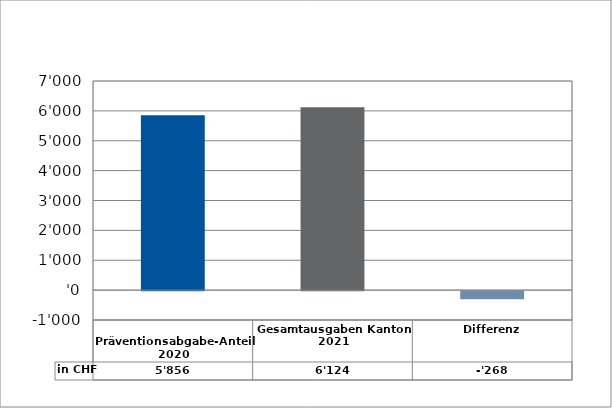
| Category | in CHF |
|---|---|
| 
Präventionsabgabe-Anteil 2020

 | 5855.85 |
| Gesamtausgaben Kanton 2021
 | 6123.78 |
| Differenz | -267.93 |